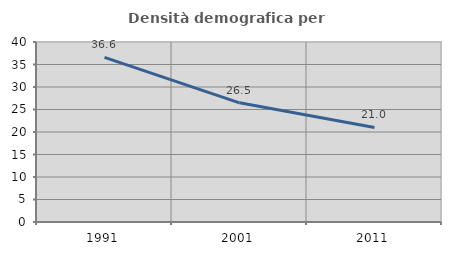
| Category | Densità demografica |
|---|---|
| 1991.0 | 36.571 |
| 2001.0 | 26.482 |
| 2011.0 | 21.018 |